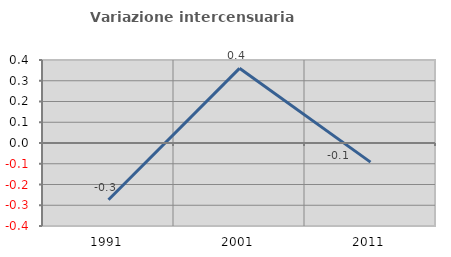
| Category | Variazione intercensuaria annua |
|---|---|
| 1991.0 | -0.274 |
| 2001.0 | 0.36 |
| 2011.0 | -0.092 |